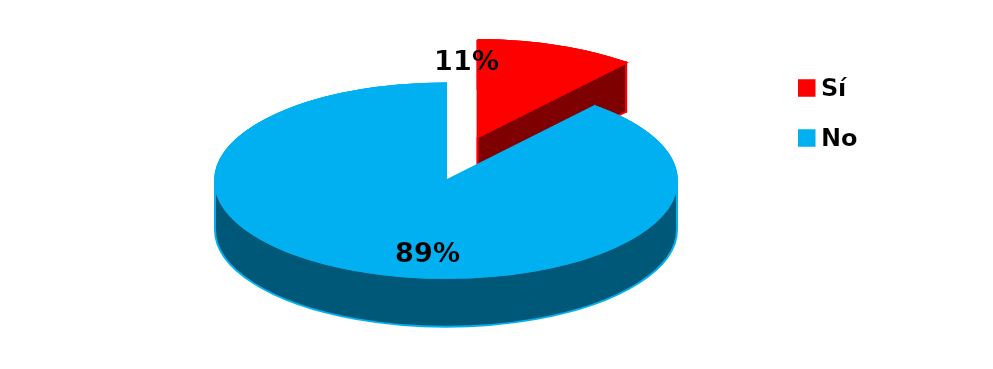
| Category | Series 0 |
|---|---|
| 0 | 1 |
| 1 | 8 |